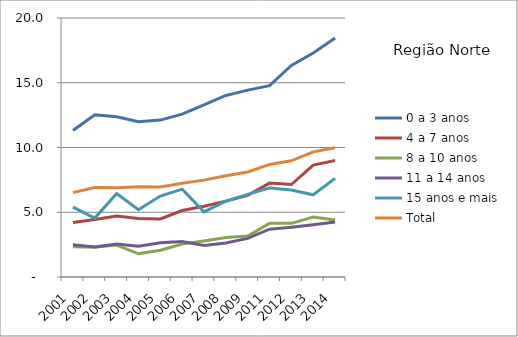
| Category | 0 a 3 anos | 4 a 7 anos | 8 a 10 anos | 11 a 14 anos | 15 anos e mais | Total |
|---|---|---|---|---|---|---|
| 2001.0 | 11.316 | 4.205 | 2.337 | 2.489 | 5.401 | 6.518 |
| 2002.0 | 12.526 | 4.446 | 2.289 | 2.322 | 4.554 | 6.912 |
| 2003.0 | 12.371 | 4.705 | 2.462 | 2.546 | 6.438 | 6.89 |
| 2004.0 | 11.993 | 4.525 | 1.793 | 2.368 | 5.193 | 6.978 |
| 2005.0 | 12.117 | 4.484 | 2.068 | 2.649 | 6.252 | 6.946 |
| 2006.0 | 12.576 | 5.13 | 2.542 | 2.736 | 6.781 | 7.238 |
| 2007.0 | 13.294 | 5.466 | 2.781 | 2.429 | 5.026 | 7.481 |
| 2008.0 | 14.016 | 5.859 | 3.055 | 2.631 | 5.854 | 7.82 |
| 2009.0 | 14.43 | 6.301 | 3.166 | 2.98 | 6.381 | 8.107 |
| 2011.0 | 14.776 | 7.249 | 4.144 | 3.691 | 6.88 | 8.695 |
| 2012.0 | 16.336 | 7.142 | 4.143 | 3.846 | 6.712 | 8.971 |
| 2013.0 | 17.295 | 8.647 | 4.637 | 4.035 | 6.347 | 9.664 |
| 2014.0 | 18.451 | 8.995 | 4.395 | 4.24 | 7.617 | 9.984 |